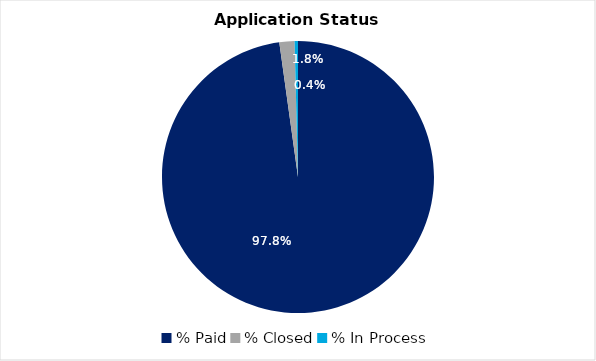
| Category | Series 0 |
|---|---|
| % Paid | 0.978 |
| % Closed | 0.018 |
| % In Process | 0.004 |